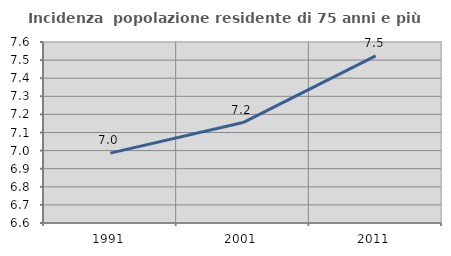
| Category | Incidenza  popolazione residente di 75 anni e più |
|---|---|
| 1991.0 | 6.986 |
| 2001.0 | 7.155 |
| 2011.0 | 7.524 |